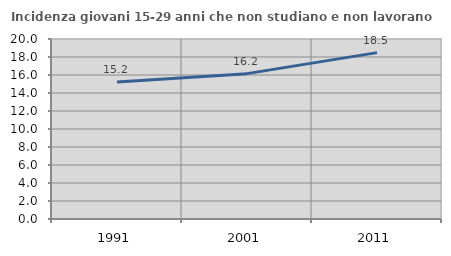
| Category | Incidenza giovani 15-29 anni che non studiano e non lavorano  |
|---|---|
| 1991.0 | 15.213 |
| 2001.0 | 16.151 |
| 2011.0 | 18.484 |